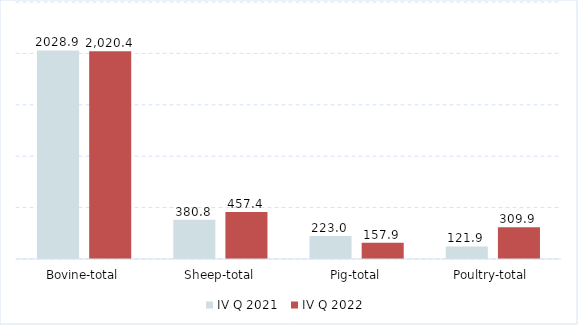
| Category | IV Q 2021 | IV Q 2022 |
|---|---|---|
| Bovine-total | 2028.923 | 2020.4 |
| Sheep-total | 380.8 | 457.4 |
| Pig-total | 222.985 | 157.9 |
| Poultry-total | 121.9 | 309.9 |